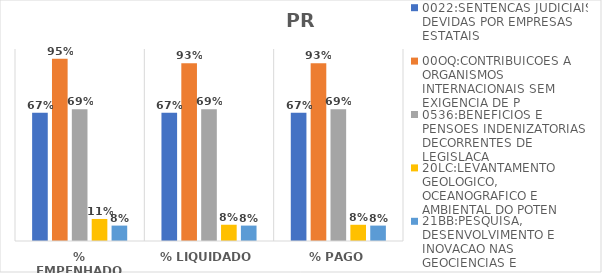
| Category | 0022:SENTENCAS JUDICIAIS DEVIDAS POR EMPRESAS ESTATAIS | 00OQ:CONTRIBUICOES A ORGANISMOS INTERNACIONAIS SEM EXIGENCIA DE P | 0536:BENEFICIOS E PENSOES INDENIZATORIAS DECORRENTES DE LEGISLACA | 20LC:LEVANTAMENTO GEOLOGICO, OCEANOGRAFICO E AMBIENTAL DO POTEN | 21BB:PESQUISA, DESENVOLVIMENTO E INOVACAO NAS GEOCIENCIAS E |
|---|---|---|---|---|---|
| % EMPENHADO | 0.668 | 0.95 | 0.687 | 0.115 | 0.08 |
| % LIQUIDADO | 0.668 | 0.926 | 0.687 | 0.085 | 0.08 |
| % PAGO | 0.668 | 0.926 | 0.687 | 0.084 | 0.08 |